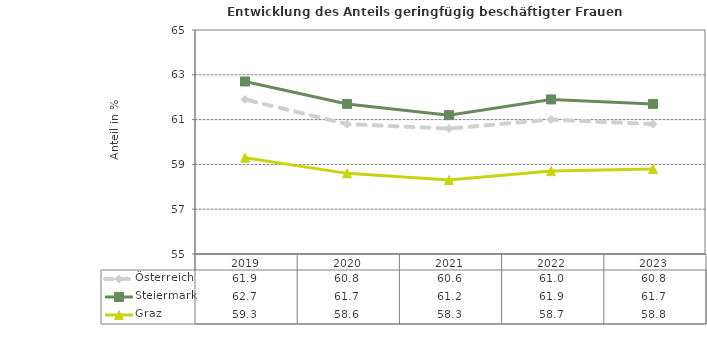
| Category | Österreich | Steiermark | Graz |
|---|---|---|---|
| 2023.0 | 60.8 | 61.7 | 58.8 |
| 2022.0 | 61 | 61.9 | 58.7 |
| 2021.0 | 60.6 | 61.2 | 58.3 |
| 2020.0 | 60.8 | 61.7 | 58.6 |
| 2019.0 | 61.9 | 62.7 | 59.3 |